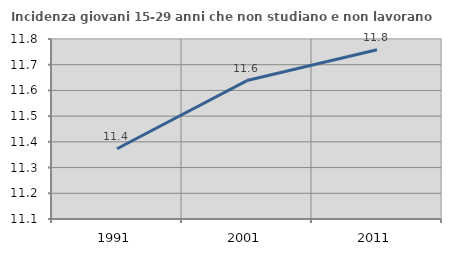
| Category | Incidenza giovani 15-29 anni che non studiano e non lavorano  |
|---|---|
| 1991.0 | 11.373 |
| 2001.0 | 11.638 |
| 2011.0 | 11.758 |